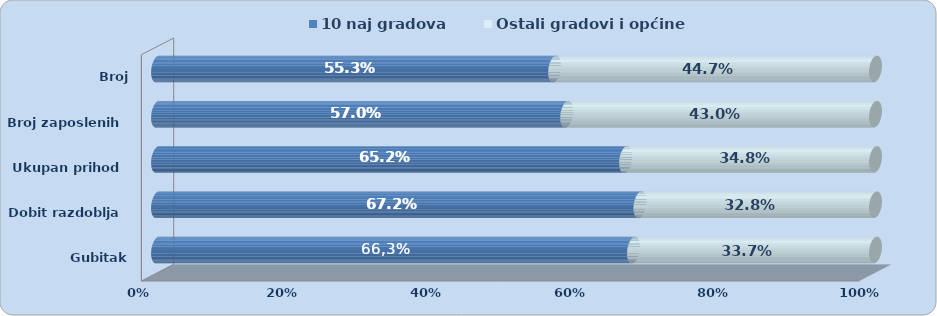
| Category | 10 naj gradova | Ostali gradovi i općine |
|---|---|---|
| Gubitak razdoblja | 0.663 | 0.337 |
| Dobit razdoblja | 0.672 | 0.328 |
| Ukupan prihod | 0.652 | 0.348 |
| Broj zaposlenih | 0.57 | 0.43 |
| Broj poduzetnika | 0.553 | 0.447 |